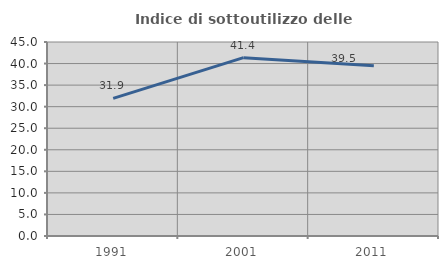
| Category | Indice di sottoutilizzo delle abitazioni  |
|---|---|
| 1991.0 | 31.917 |
| 2001.0 | 41.373 |
| 2011.0 | 39.487 |